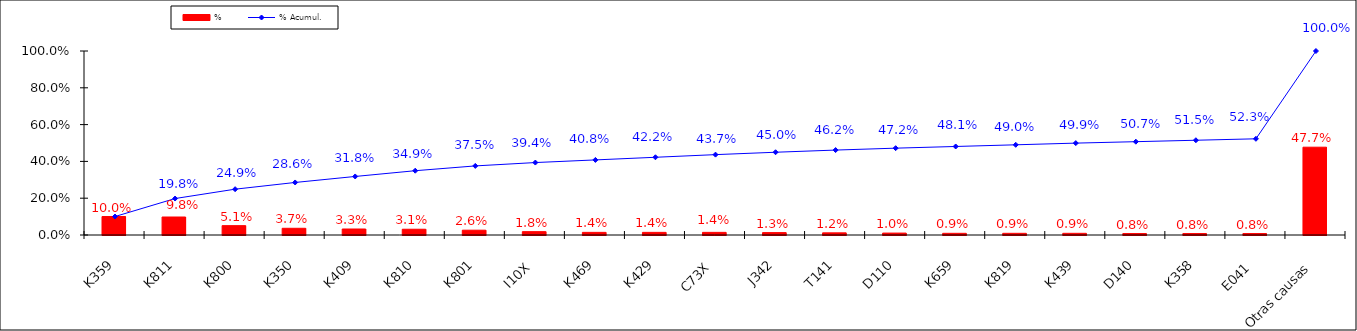
| Category | % |
|---|---|
| K359 | 0.1 |
| K811 | 0.098 |
| K800 | 0.051 |
| K350 | 0.037 |
| K409 | 0.033 |
| K810 | 0.031 |
| K801 | 0.026 |
| I10X | 0.018 |
| K469 | 0.014 |
| K429 | 0.014 |
| C73X | 0.014 |
| J342 | 0.013 |
| T141 | 0.012 |
| D110 | 0.01 |
| K659 | 0.009 |
| K819 | 0.009 |
| K439 | 0.009 |
| D140 | 0.008 |
| K358 | 0.008 |
| E041 | 0.008 |
| Otras causas | 0.477 |